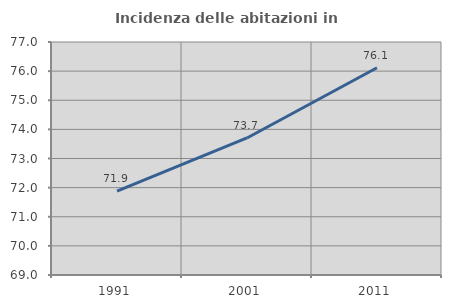
| Category | Incidenza delle abitazioni in proprietà  |
|---|---|
| 1991.0 | 71.879 |
| 2001.0 | 73.706 |
| 2011.0 | 76.117 |